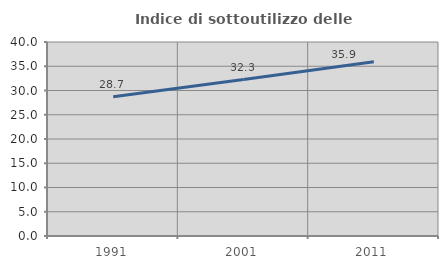
| Category | Indice di sottoutilizzo delle abitazioni  |
|---|---|
| 1991.0 | 28.734 |
| 2001.0 | 32.258 |
| 2011.0 | 35.92 |